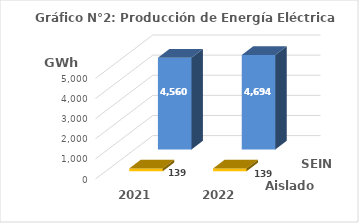
| Category | Aislados | SEIN |
|---|---|---|
| 2021.0 | 138.924 | 4560.318 |
| 2022.0 | 139.462 | 4694.244 |